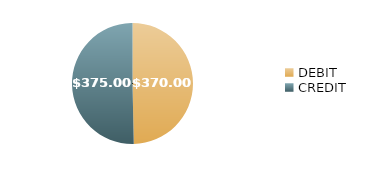
| Category | $370.00 |
|---|---|
| DEBIT | 370 |
| CREDIT | 375 |